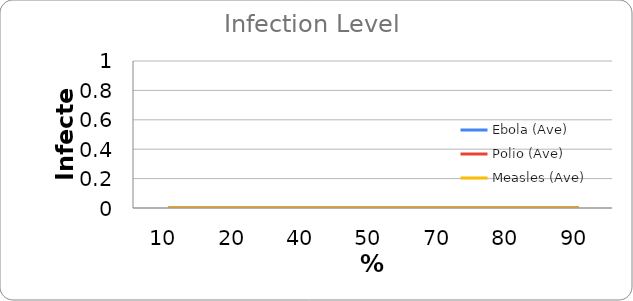
| Category | Ebola (Ave) | Polio (Ave) | Measles (Ave) |
|---|---|---|---|
| 10.0 | 0 | 0 | 0 |
| 20.0 | 0 | 0 | 0 |
| 40.0 | 0 | 0 | 0 |
| 50.0 | 0 | 0 | 0 |
| 70.0 | 0 | 0 | 0 |
| 80.0 | 0 | 0 | 0 |
| 90.0 | 0 | 0 | 0 |